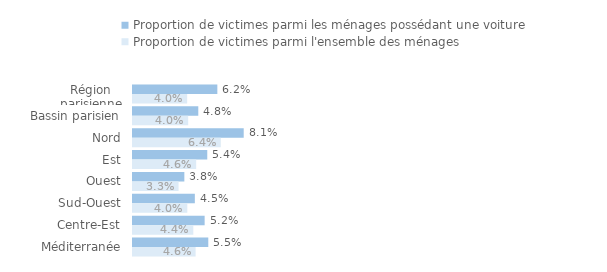
| Category | Proportion de victimes parmi les ménages possédant une voiture | Proportion de victimes parmi l'ensemble des ménages |
|---|---|---|
| Région parisienne | 0.062 | 0.04 |
| Bassin parisien | 0.048 | 0.04 |
| Nord | 0.081 | 0.064 |
| Est | 0.054 | 0.046 |
| Ouest | 0.038 | 0.033 |
| Sud-Ouest | 0.045 | 0.04 |
| Centre-Est | 0.052 | 0.044 |
| Méditerranée | 0.055 | 0.046 |